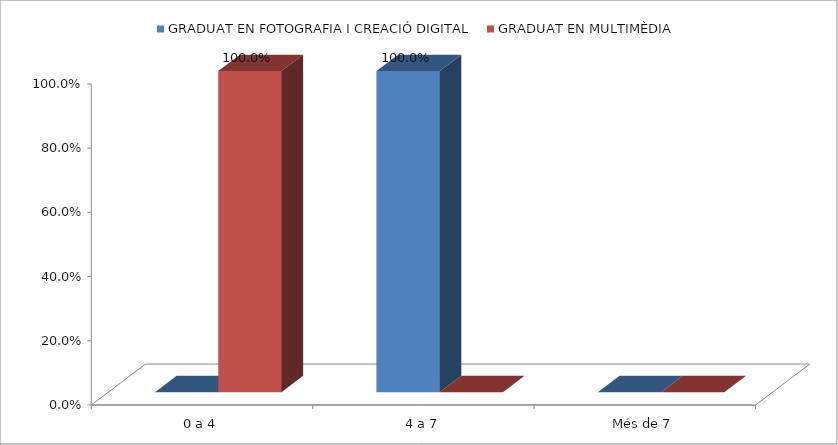
| Category | GRADUAT EN FOTOGRAFIA I CREACIÓ DIGITAL | GRADUAT EN MULTIMÈDIA |
|---|---|---|
| 0 a 4 | 0 | 1 |
| 4 a 7 | 1 | 0 |
| Més de 7 | 0 | 0 |